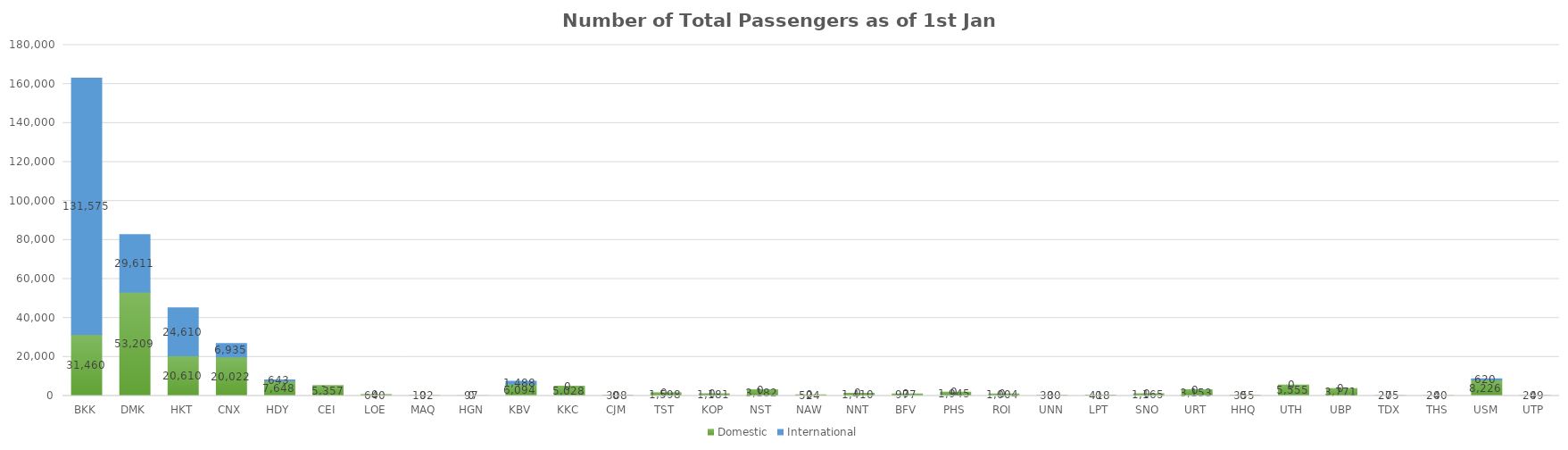
| Category | Domestic | International |
|---|---|---|
| BKK | 31460 | 131575 |
| DMK | 53209 | 29611 |
| HKT | 20610 | 24610 |
| CNX | 20022 | 6935 |
| HDY | 7648 | 643 |
| CEI | 5357 | 0 |
| LOE | 640 | 0 |
| MAQ | 192 | 0 |
| HGN | 97 | 0 |
| KBV | 6094 | 1488 |
| KKC | 5028 | 0 |
| CJM | 308 | 0 |
| TST | 1598 | 0 |
| KOP | 1181 | 0 |
| NST | 3182 | 0 |
| NAW | 524 | 0 |
| NNT | 1410 | 0 |
| BFV | 977 | 0 |
| PHS | 1945 | 0 |
| ROI | 1004 | 0 |
| UNN | 330 | 0 |
| LPT | 418 | 0 |
| SNO | 1165 | 0 |
| URT | 3153 | 0 |
| HHQ | 355 | 0 |
| UTH | 5555 | 0 |
| UBP | 3771 | 0 |
| TDX | 275 | 0 |
| THS | 240 | 0 |
| USM | 8226 | 620 |
| UTP | 249 | 0 |